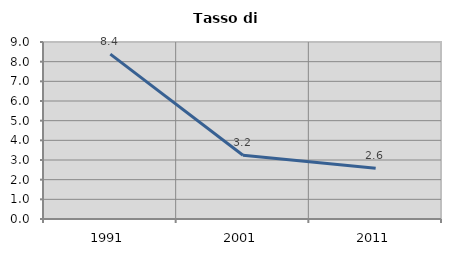
| Category | Tasso di disoccupazione   |
|---|---|
| 1991.0 | 8.383 |
| 2001.0 | 3.243 |
| 2011.0 | 2.577 |